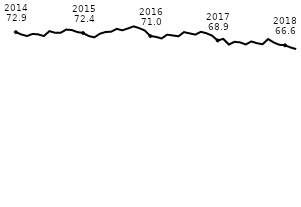
| Category | Series 0 |
|---|---|
| 1905-07-06 | 72.856 |
| nan | 71.712 |
| nan | 70.991 |
| nan | 72.004 |
| nan | 71.763 |
| nan | 70.991 |
| nan | 73.302 |
| nan | 72.531 |
| nan | 72.536 |
| nan | 74.058 |
| nan | 73.813 |
| nan | 72.85 |
| 1905-07-07 | 72.43 |
| nan | 70.997 |
| nan | 70.36 |
| nan | 72.085 |
| nan | 72.887 |
| nan | 73.062 |
| nan | 74.386 |
| nan | 73.691 |
| nan | 74.579 |
| nan | 75.575 |
| nan | 74.737 |
| nan | 73.611 |
| 1905-07-08 | 70.989 |
| nan | 70.581 |
| nan | 69.85 |
| nan | 71.636 |
| nan | 71.263 |
| nan | 70.859 |
| nan | 72.838 |
| nan | 72.236 |
| nan | 71.669 |
| nan | 73 |
| nan | 72.292 |
| nan | 71.187 |
| 1905-07-09 | 68.857 |
| nan | 69.641 |
| nan | 66.958 |
| nan | 68.251 |
| nan | 67.981 |
| nan | 66.984 |
| nan | 68.42 |
| nan | 67.6 |
| nan | 67.103 |
| nan | 69.559 |
| nan | 67.932 |
| nan | 66.844 |
| 1905-07-10 | 66.617 |
| nan | 65.582 |
| nan | 64.792 |